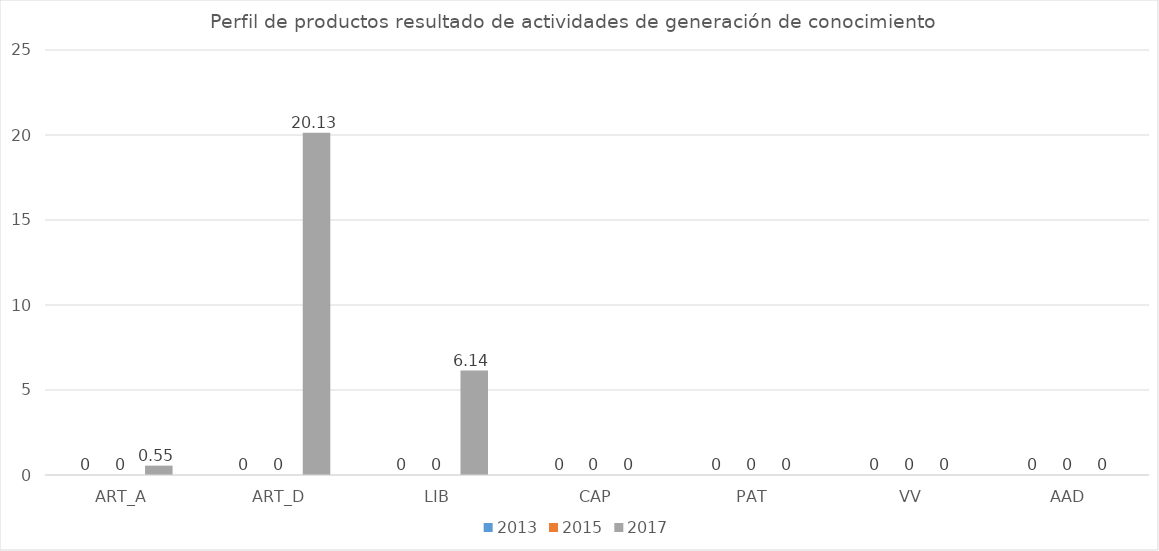
| Category | 2013 | 2015 | 2017 |
|---|---|---|---|
| ART_A | 0 | 0 | 0.55 |
| ART_D | 0 | 0 | 20.13 |
| LIB | 0 | 0 | 6.14 |
| CAP | 0 | 0 | 0 |
| PAT | 0 | 0 | 0 |
| VV | 0 | 0 | 0 |
| AAD | 0 | 0 | 0 |